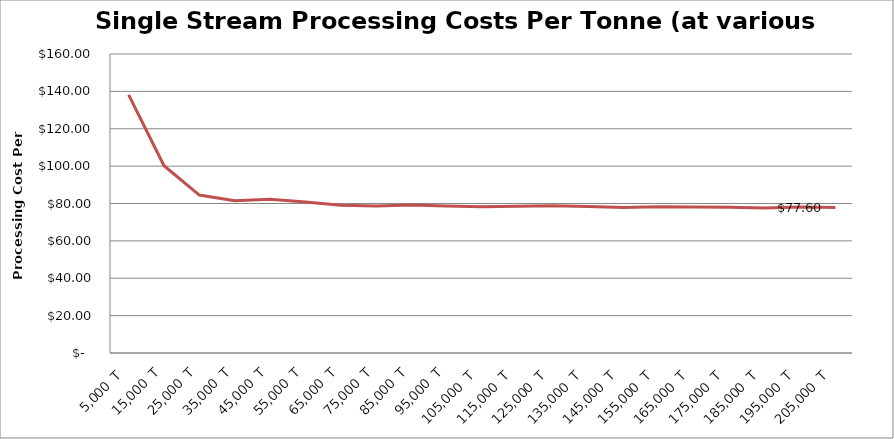
| Category | Series 1 |
|---|---|
| 5000.0 | 138.142 |
| 15000.0 | 100.192 |
| 25000.0 | 84.493 |
| 35000.0 | 81.523 |
| 45000.0 | 82.33 |
| 55000.0 | 80.833 |
| 65000.0 | 79.111 |
| 75000.0 | 78.707 |
| 85000.0 | 79.232 |
| 95000.0 | 78.692 |
| 105000.0 | 78.295 |
| 115000.0 | 78.463 |
| 125000.0 | 78.73 |
| 135000.0 | 78.432 |
| 145000.0 | 77.92 |
| 155000.0 | 78.276 |
| 165000.0 | 78.072 |
| 175000.0 | 77.997 |
| 185000.0 | 77.6 |
| 195000.0 | 78.093 |
| 205000.0 | 77.902 |